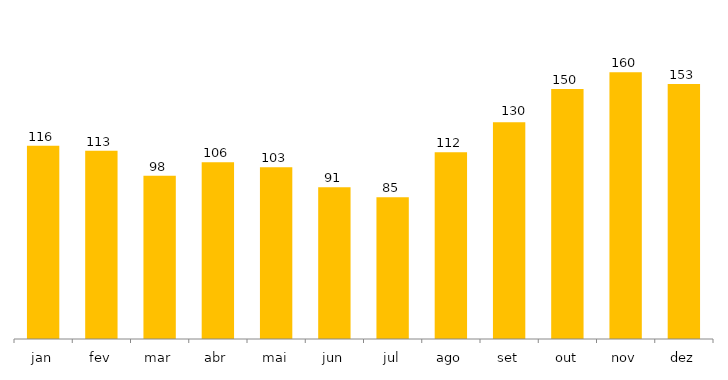
| Category | 2018 |
|---|---|
| jan | 116 |
| fev | 113 |
| mar | 98 |
| abr | 106 |
| mai | 103 |
| jun | 91 |
| jul | 85 |
| ago | 112 |
| set | 130 |
| out | 150 |
| nov | 160 |
| dez | 153 |